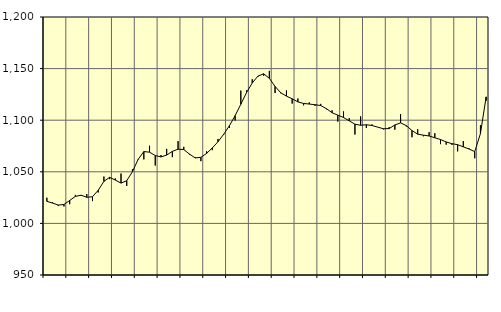
| Category | Piggar | Series 1 |
|---|---|---|
| nan | 1024.9 | 1021.36 |
| 1.0 | 1020.5 | 1019.7 |
| 1.0 | 1016.8 | 1017.78 |
| 1.0 | 1016.4 | 1018.34 |
| nan | 1018.6 | 1022.22 |
| 2.0 | 1027.6 | 1026.17 |
| 2.0 | 1026.6 | 1027.33 |
| 2.0 | 1028.5 | 1025.29 |
| nan | 1021.6 | 1025.85 |
| 3.0 | 1030 | 1032.08 |
| 3.0 | 1045.4 | 1040.68 |
| 3.0 | 1042.9 | 1044.65 |
| nan | 1043.6 | 1041.96 |
| 4.0 | 1048.3 | 1039.05 |
| 4.0 | 1036.3 | 1041.36 |
| 4.0 | 1052.4 | 1050.04 |
| nan | 1061.6 | 1062.05 |
| 5.0 | 1062 | 1069.59 |
| 5.0 | 1075.2 | 1069.02 |
| 5.0 | 1056.1 | 1065.77 |
| nan | 1066.2 | 1064.43 |
| 6.0 | 1072.2 | 1066.2 |
| 6.0 | 1064.2 | 1069.78 |
| 6.0 | 1079.7 | 1071.93 |
| nan | 1074.2 | 1071.51 |
| 7.0 | 1066.5 | 1067.18 |
| 7.0 | 1064.3 | 1063.44 |
| 7.0 | 1060.3 | 1064.03 |
| nan | 1069.9 | 1067.8 |
| 8.0 | 1071 | 1073.13 |
| 8.0 | 1081.8 | 1079.12 |
| 8.0 | 1085.7 | 1086.42 |
| nan | 1092.6 | 1094.68 |
| 9.0 | 1099.7 | 1104.4 |
| 9.0 | 1128.7 | 1115.47 |
| 9.0 | 1128.9 | 1126.77 |
| nan | 1139.7 | 1136.06 |
| 10.0 | 1142.2 | 1142.74 |
| 10.0 | 1143.1 | 1144.95 |
| 10.0 | 1147.8 | 1140.62 |
| nan | 1126.3 | 1132.73 |
| 11.0 | 1126.1 | 1126.56 |
| 11.0 | 1128.9 | 1123.35 |
| 11.0 | 1116.1 | 1120.68 |
| nan | 1121 | 1117.74 |
| 12.0 | 1114.4 | 1116.23 |
| 12.0 | 1117.3 | 1115.65 |
| 12.0 | 1113.9 | 1114.99 |
| nan | 1115.8 | 1114.23 |
| 13.0 | 1110.6 | 1111.19 |
| 13.0 | 1109.6 | 1107.23 |
| 13.0 | 1098.7 | 1104.9 |
| nan | 1108.5 | 1102.59 |
| 14.0 | 1102 | 1099.38 |
| 14.0 | 1086.1 | 1096.15 |
| 14.0 | 1103.7 | 1095.07 |
| nan | 1092.5 | 1095.61 |
| 15.0 | 1095.9 | 1094.85 |
| 15.0 | 1093.4 | 1093.28 |
| 15.0 | 1091.1 | 1091.69 |
| nan | 1093.3 | 1091.89 |
| 16.0 | 1090.8 | 1095.41 |
| 16.0 | 1105.9 | 1097.4 |
| 16.0 | 1094 | 1094.78 |
| nan | 1083.5 | 1089.96 |
| 17.0 | 1091.3 | 1086.47 |
| 17.0 | 1084.4 | 1085.5 |
| 17.0 | 1088.4 | 1084.69 |
| nan | 1087.4 | 1082.99 |
| 18.0 | 1076.8 | 1081.26 |
| 18.0 | 1076.3 | 1078.91 |
| 18.0 | 1076.1 | 1077.26 |
| nan | 1069.8 | 1076.28 |
| 19.0 | 1079.8 | 1074.16 |
| 19.0 | 1072.7 | 1072.07 |
| 19.0 | 1063.1 | 1069.54 |
| nan | 1095.1 | 1087.03 |
| 20.0 | 1118.9 | 1122.62 |